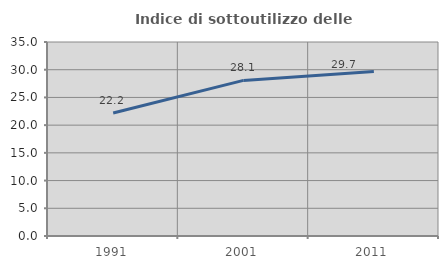
| Category | Indice di sottoutilizzo delle abitazioni  |
|---|---|
| 1991.0 | 22.195 |
| 2001.0 | 28.074 |
| 2011.0 | 29.691 |